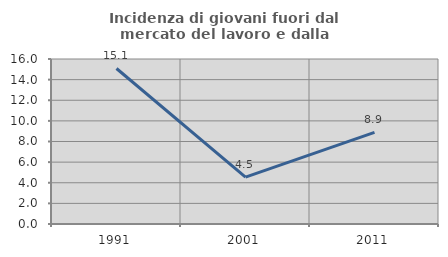
| Category | Incidenza di giovani fuori dal mercato del lavoro e dalla formazione  |
|---|---|
| 1991.0 | 15.079 |
| 2001.0 | 4.545 |
| 2011.0 | 8.889 |